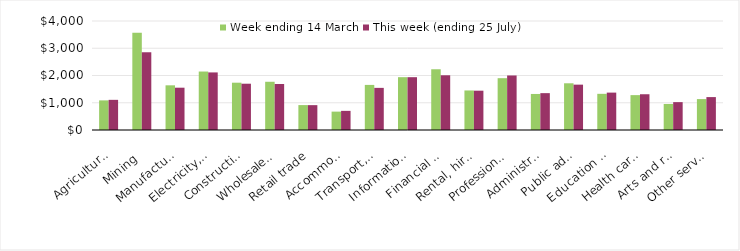
| Category | Week ending 14 March | This week (ending 25 July) |
|---|---|---|
| Agriculture, forestry and fishing | 1086.73 | 1106.69 |
| Mining | 3569.48 | 2852.92 |
| Manufacturing | 1639.76 | 1552.37 |
| Electricity, gas, water and waste services | 2145.55 | 2112.93 |
| Construction | 1735.92 | 1698.69 |
| Wholesale trade | 1770.14 | 1688.22 |
| Retail trade | 914.26 | 912.19 |
| Accommodation and food services | 674.41 | 702.17 |
| Transport, postal and warehousing | 1654.78 | 1545.99 |
| Information media and telecommunications | 1938.6 | 1937.93 |
| Financial and insurance services | 2229.09 | 2008.67 |
| Rental, hiring and real estate services | 1451.14 | 1442.82 |
| Professional, scientific and technical services | 1901.34 | 2000.71 |
| Administrative and support services | 1322.47 | 1352.54 |
| Public administration and safety | 1714.26 | 1664.43 |
| Education and training | 1327.72 | 1372.24 |
| Health care and social assistance | 1279.99 | 1312.19 |
| Arts and recreation services | 955.33 | 1022.79 |
| Other services | 1134.24 | 1207.61 |